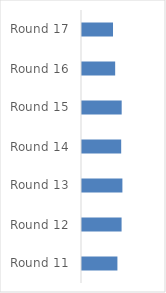
| Category | Series 0 |
|---|---|
| Round 11 | 23609 |
| Round 12 | 26390 |
| Round 13 | 26937 |
| Round 14 | 26126 |
| Round 15 | 26454 |
| Round 16 | 22112 |
| Round 17 | 20674 |